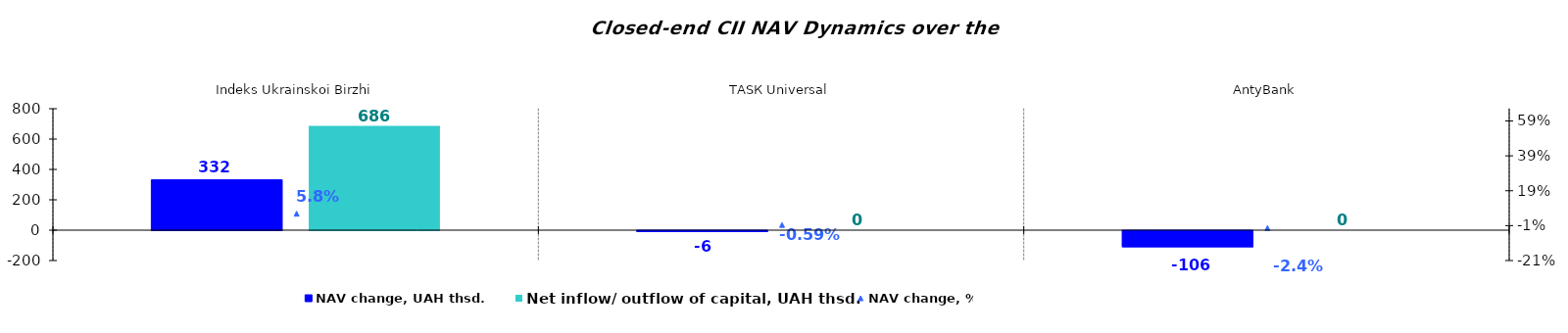
| Category | NAV change, UAH thsd. | Net inflow/ outflow of capital, UAH thsd. |
|---|---|---|
| Indeks Ukrainskoi Birzhi | 331.523 | 686.348 |
| ТАSК Universal | -6.13 | 0 |
| AntyBank | -105.963 | 0 |